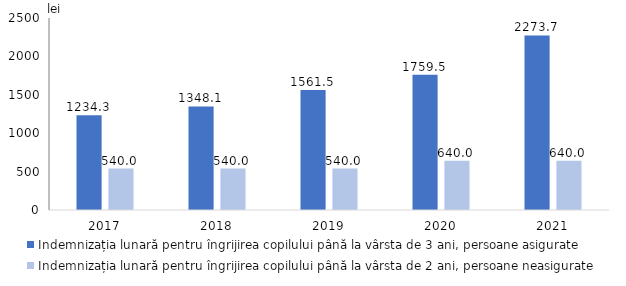
| Category | Indemnizația lunară pentru îngrijirea copilului până la vârsta de 3 ani, persoane asigurate | Indemnizația lunară pentru îngrijirea copilului până la vârsta de 2 ani, persoane neasigurate |
|---|---|---|
| 2017.0 | 1234.3 | 540 |
| 2018.0 | 1348.1 | 540 |
| 2019.0 | 1561.5 | 540 |
| 2020.0 | 1759.5 | 640 |
| 2021.0 | 2273.7 | 640 |